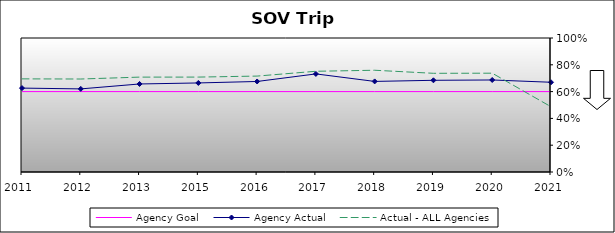
| Category | Agency Goal | Agency Actual | Actual - ALL Agencies |
|---|---|---|---|
| 2011.0 | 0.6 | 0.626 | 0.695 |
| 2012.0 | 0.6 | 0.62 | 0.694 |
| 2013.0 | 0.6 | 0.657 | 0.708 |
| 2015.0 | 0.6 | 0.665 | 0.708 |
| 2016.0 | 0.6 | 0.676 | 0.716 |
| 2017.0 | 0.6 | 0.732 | 0.752 |
| 2018.0 | 0.6 | 0.676 | 0.759 |
| 2019.0 | 0.6 | 0.684 | 0.736 |
| 2020.0 | 0.6 | 0.687 | 0.737 |
| 2021.0 | 0.6 | 0.67 | 0.487 |